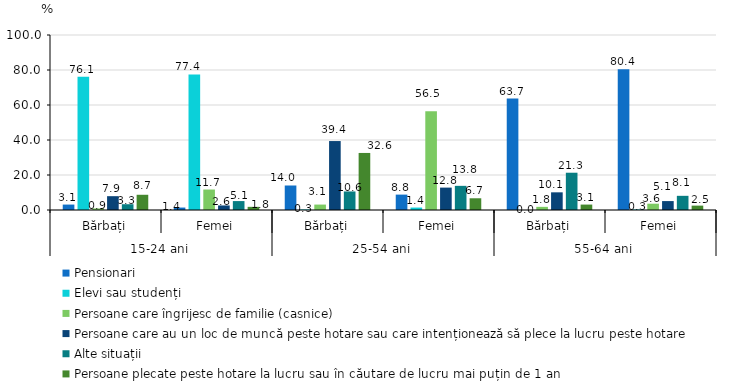
| Category | Pensionari | Elevi sau studenți | Persoane care îngrijesc de familie (casnice) | Persoane care au un loc de muncă peste hotare sau care intenționează să plece la lucru peste hotare | Alte situații | Persoane plecate peste hotare la lucru sau în căutare de lucru mai puțin de 1 an |
|---|---|---|---|---|---|---|
| 0 | 3.1 | 76.1 | 0.9 | 7.9 | 3.3 | 8.7 |
| 1 | 1.4 | 77.4 | 11.7 | 2.6 | 5.1 | 1.8 |
| 2 | 14 | 0.3 | 3.1 | 39.4 | 10.6 | 32.6 |
| 3 | 8.8 | 1.4 | 56.5 | 12.8 | 13.8 | 6.7 |
| 4 | 63.7 | 0 | 1.8 | 10.1 | 21.3 | 3.1 |
| 5 | 80.4 | 0.3 | 3.6 | 5.1 | 8.1 | 2.5 |